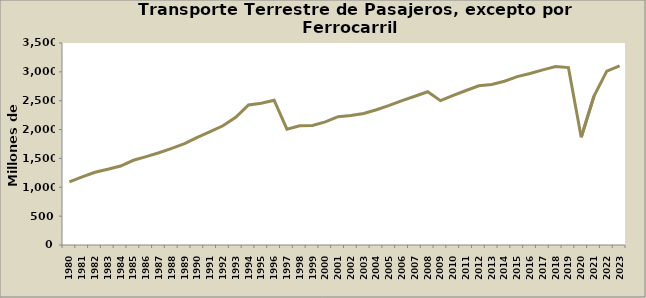
| Category | Series 0 |
|---|---|
| 1980.0 | 1094 |
| 1981.0 | 1180 |
| 1982.0 | 1261 |
| 1983.0 | 1312 |
| 1984.0 | 1368 |
| 1985.0 | 1468 |
| 1986.0 | 1531 |
| 1987.0 | 1599 |
| 1988.0 | 1673 |
| 1989.0 | 1758 |
| 1990.0 | 1865 |
| 1991.0 | 1965 |
| 1992.0 | 2066 |
| 1993.0 | 2212 |
| 1994.0 | 2426 |
| 1995.0 | 2457 |
| 1996.0 | 2509 |
| 1997.0 | 2008 |
| 1998.0 | 2065 |
| 1999.0 | 2070 |
| 2000.0 | 2134 |
| 2001.0 | 2224 |
| 2002.0 | 2245 |
| 2003.0 | 2279 |
| 2004.0 | 2344 |
| 2005.0 | 2418 |
| 2006.0 | 2503 |
| 2007.0 | 2578 |
| 2008.0 | 2655 |
| 2009.0 | 2501 |
| 2010.0 | 2591 |
| 2011.0 | 2677 |
| 2012.0 | 2758 |
| 2013.0 | 2781 |
| 2014.0 | 2836.795 |
| 2015.0 | 2918 |
| 2016.0 | 2970.86 |
| 2017.0 | 3034.82 |
| 2018.0 | 3093.86 |
| 2019.0 | 3074.18 |
| 2020.0 | 1867 |
| 2021.0 | 2580.54 |
| 2022.0 | 3013 |
| 2023.0 | 3104 |